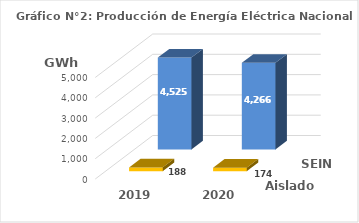
| Category | Aislados | SEIN |
|---|---|---|
| 2019.0 | 187.791 | 4525.403 |
| 2020.0 | 174.261 | 4266.334 |